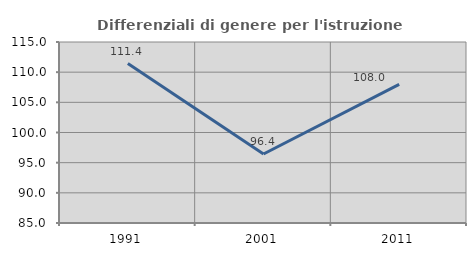
| Category | Differenziali di genere per l'istruzione superiore |
|---|---|
| 1991.0 | 111.42 |
| 2001.0 | 96.431 |
| 2011.0 | 107.989 |